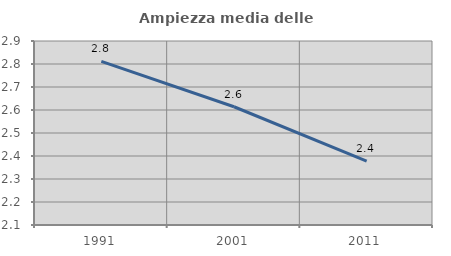
| Category | Ampiezza media delle famiglie |
|---|---|
| 1991.0 | 2.811 |
| 2001.0 | 2.614 |
| 2011.0 | 2.378 |